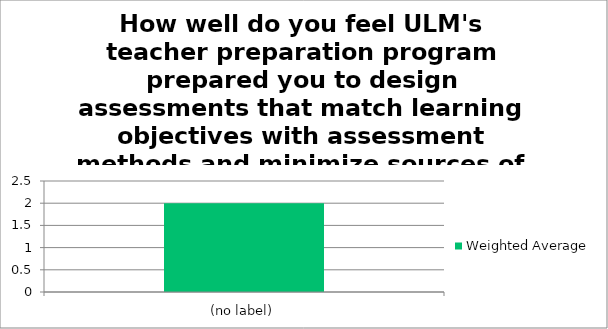
| Category | Weighted Average |
|---|---|
| (no label) | 2 |